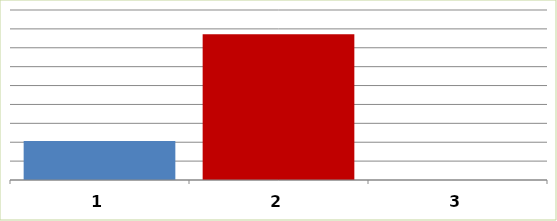
| Category | Series 0 |
|---|---|
| 0 | 20649000 |
| 1 | 77100187 |
| 2 | 0 |